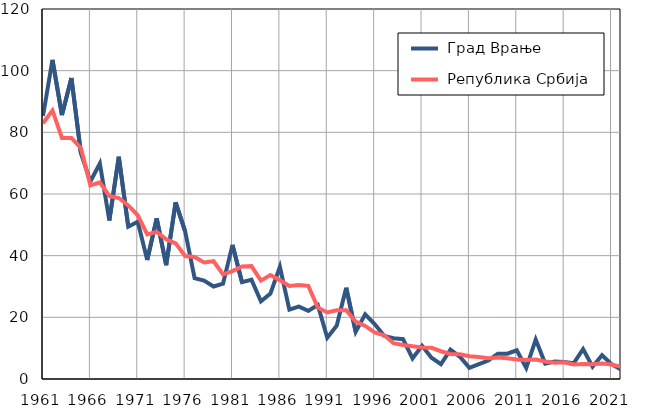
| Category |  Град Врање |  Република Србија |
|---|---|---|
| 1961.0 | 85.3 | 82.9 |
| 1962.0 | 103.5 | 87.1 |
| 1963.0 | 85.6 | 78.2 |
| 1964.0 | 97.6 | 78.2 |
| 1965.0 | 73.2 | 74.9 |
| 1966.0 | 64.1 | 62.8 |
| 1967.0 | 69.9 | 63.8 |
| 1968.0 | 51.4 | 59.4 |
| 1969.0 | 72.1 | 58.7 |
| 1970.0 | 49.4 | 56.3 |
| 1971.0 | 51 | 53.1 |
| 1972.0 | 38.6 | 46.9 |
| 1973.0 | 52.1 | 47.7 |
| 1974.0 | 36.9 | 45.3 |
| 1975.0 | 57.3 | 44 |
| 1976.0 | 47.9 | 39.9 |
| 1977.0 | 32.7 | 39.6 |
| 1978.0 | 31.9 | 37.8 |
| 1979.0 | 30 | 38.2 |
| 1980.0 | 30.9 | 33.9 |
| 1981.0 | 43.5 | 35 |
| 1982.0 | 31.4 | 36.5 |
| 1983.0 | 32.2 | 36.6 |
| 1984.0 | 25.2 | 31.9 |
| 1985.0 | 27.7 | 33.7 |
| 1986.0 | 36.4 | 32 |
| 1987.0 | 22.5 | 30.2 |
| 1988.0 | 23.5 | 30.5 |
| 1989.0 | 22.1 | 30.2 |
| 1990.0 | 24 | 23.2 |
| 1991.0 | 13.4 | 21.6 |
| 1992.0 | 17.3 | 22.3 |
| 1993.0 | 29.6 | 22.3 |
| 1994.0 | 15.3 | 18.6 |
| 1995.0 | 21 | 17.2 |
| 1996.0 | 17.8 | 15.1 |
| 1997.0 | 14 | 14.2 |
| 1998.0 | 13.2 | 11.6 |
| 1999.0 | 12.9 | 11 |
| 2000.0 | 6.7 | 10.6 |
| 2001.0 | 10.8 | 10.2 |
| 2002.0 | 6.9 | 10.1 |
| 2003.0 | 4.8 | 9 |
| 2004.0 | 9.5 | 8.1 |
| 2005.0 | 7.2 | 8 |
| 2006.0 | 3.6 | 7.4 |
| 2007.0 | 4.8 | 7.1 |
| 2008.0 | 6 | 6.7 |
| 2009.0 | 8.2 | 7 |
| 2010.0 | 8.2 | 6.7 |
| 2011.0 | 9.3 | 6.3 |
| 2012.0 | 3.6 | 6.2 |
| 2013.0 | 12.8 | 6.3 |
| 2014.0 | 5 | 5.7 |
| 2015.0 | 5.7 | 5.3 |
| 2016.0 | 5.5 | 5.4 |
| 2017.0 | 5.1 | 4.7 |
| 2018.0 | 9.7 | 4.9 |
| 2019.0 | 4 | 4.8 |
| 2020.0 | 7.7 | 5 |
| 2021.0 | 4.8 | 4.7 |
| 2022.0 | 3.1 | 4 |